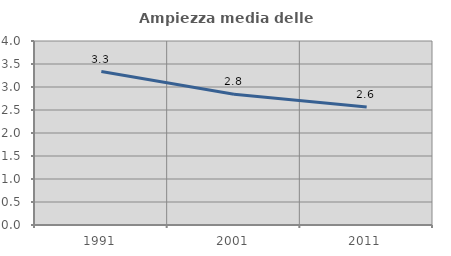
| Category | Ampiezza media delle famiglie |
|---|---|
| 1991.0 | 3.336 |
| 2001.0 | 2.841 |
| 2011.0 | 2.565 |